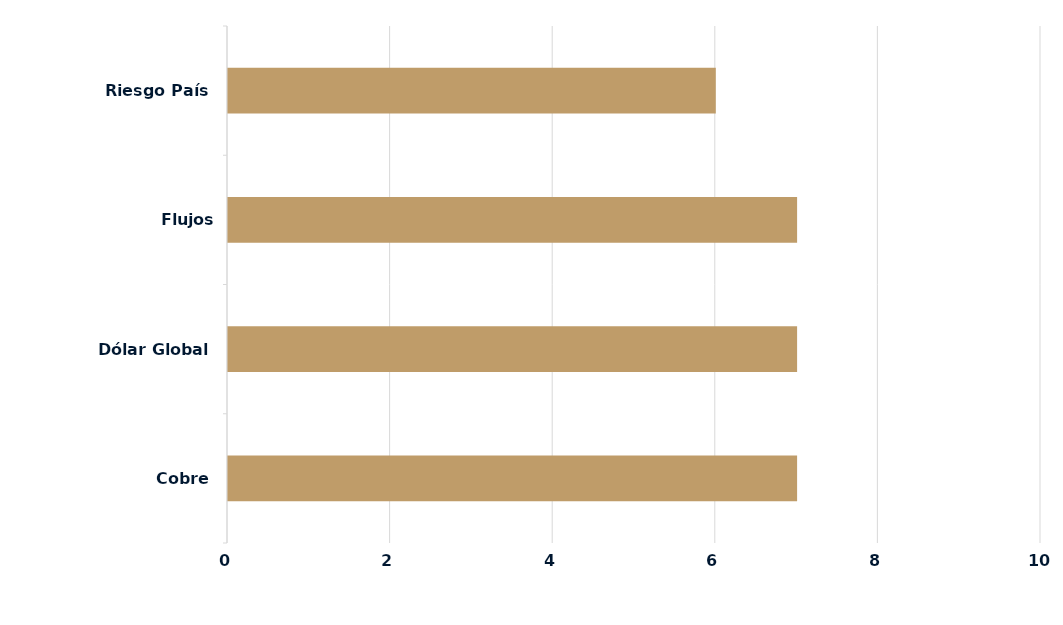
| Category | Series 0 |
|---|---|
| Cobre | 7 |
| Dólar Global | 7 |
| Flujos Locales/Extranjeros | 7 |
| Riesgo País | 6 |